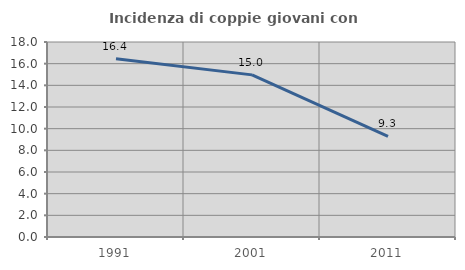
| Category | Incidenza di coppie giovani con figli |
|---|---|
| 1991.0 | 16.447 |
| 2001.0 | 14.965 |
| 2011.0 | 9.286 |